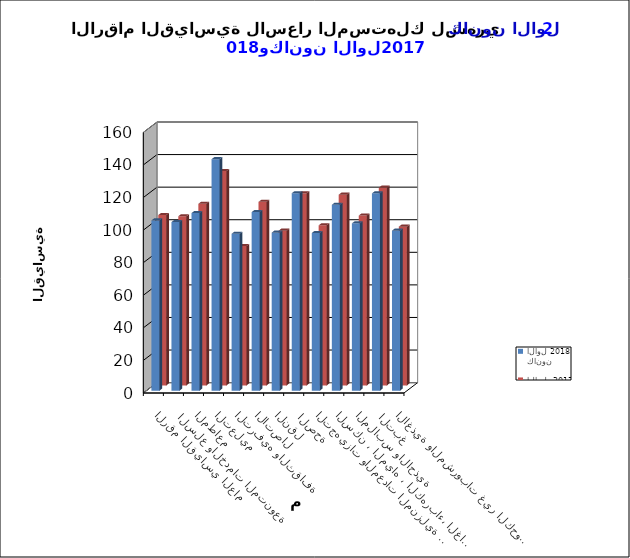
| Category | كانون الاول 2018      | كانون الاول  2017 |
|---|---|---|
| الاغذية والمشروبات غير الكحولية | 98.2 | 97.5 |
|  التبغ | 121.1 | 121.4 |
| الملابس والاحذية | 102.7 | 104.3 |
| السكن ، المياه ، الكهرباء، الغاز  | 114.1 | 117.1 |
| التجهيزات والمعدات المنزلية والصيانة | 96.8 | 98.3 |
|  الصحة | 121.2 | 117.9 |
| النقل | 97 | 95 |
| الاتصال | 109.6 | 112.7 |
| الترفيه والثقافة | 96.3 | 85.6 |
| التعليم | 142.1 | 131.6 |
| المطاعم  | 109 | 111.5 |
|  السلع والخدمات المتنوعة | 103.5 | 103.9 |
| الرقم القياسي العام | 104.5 | 104.6 |